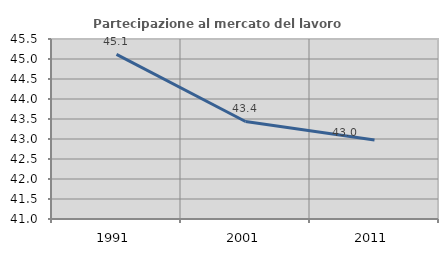
| Category | Partecipazione al mercato del lavoro  femminile |
|---|---|
| 1991.0 | 45.117 |
| 2001.0 | 43.438 |
| 2011.0 | 42.975 |